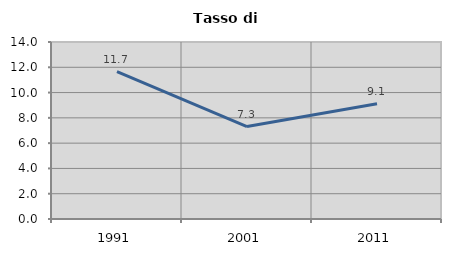
| Category | Tasso di disoccupazione   |
|---|---|
| 1991.0 | 11.653 |
| 2001.0 | 7.311 |
| 2011.0 | 9.122 |